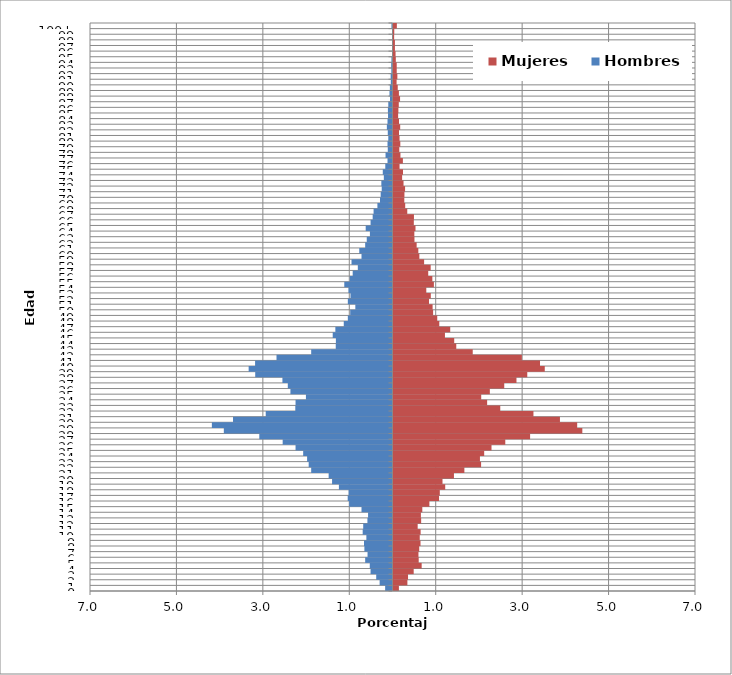
| Category | Hombres | Mujeres |
|---|---|---|
| 0 | -0.17 | 0.125 |
| 1 | -0.298 | 0.321 |
| 2 | -0.377 | 0.336 |
| 3 | -0.508 | 0.467 |
| 4 | -0.526 | 0.652 |
| 5 | -0.632 | 0.583 |
| 6 | -0.578 | 0.577 |
| 7 | -0.651 | 0.595 |
| 8 | -0.66 | 0.625 |
| 9 | -0.605 | 0.607 |
| 10 | -0.69 | 0.628 |
| 11 | -0.678 | 0.56 |
| 12 | -0.581 | 0.64 |
| 13 | -0.565 | 0.634 |
| 14 | -0.717 | 0.667 |
| 15 | -1.003 | 0.83 |
| 16 | -1.037 | 1.054 |
| 17 | -1.015 | 1.072 |
| 18 | -1.24 | 1.197 |
| 19 | -1.398 | 1.134 |
| 20 | -1.477 | 1.399 |
| 21 | -1.882 | 1.64 |
| 22 | -1.94 | 2.027 |
| 23 | -1.976 | 2 |
| 24 | -2.067 | 2.098 |
| 25 | -2.244 | 2.268 |
| 26 | -2.541 | 2.587 |
| 27 | -3.083 | 3.161 |
| 28 | -3.903 | 4.37 |
| 29 | -4.18 | 4.251 |
| 30 | -3.691 | 3.852 |
| 31 | -2.934 | 3.238 |
| 32 | -2.25 | 2.471 |
| 33 | -2.244 | 2.167 |
| 34 | -2.003 | 2.03 |
| 35 | -2.362 | 2.229 |
| 36 | -2.423 | 2.563 |
| 37 | -2.547 | 2.846 |
| 38 | -3.177 | 3.096 |
| 39 | -3.329 | 3.5 |
| 40 | -3.18 | 3.39 |
| 41 | -2.684 | 2.971 |
| 42 | -1.882 | 1.834 |
| 43 | -1.313 | 1.453 |
| 44 | -1.31 | 1.405 |
| 45 | -1.383 | 1.191 |
| 46 | -1.322 | 1.313 |
| 47 | -1.128 | 1.06 |
| 48 | -1.034 | 1.012 |
| 49 | -0.979 | 0.917 |
| 50 | -0.86 | 0.905 |
| 51 | -1.034 | 0.822 |
| 52 | -0.973 | 0.863 |
| 53 | -1.018 | 0.759 |
| 54 | -1.116 | 0.935 |
| 55 | -0.988 | 0.899 |
| 56 | -0.921 | 0.804 |
| 57 | -0.803 | 0.86 |
| 58 | -0.948 | 0.708 |
| 59 | -0.717 | 0.598 |
| 60 | -0.769 | 0.574 |
| 61 | -0.632 | 0.536 |
| 62 | -0.596 | 0.485 |
| 63 | -0.523 | 0.482 |
| 64 | -0.62 | 0.509 |
| 65 | -0.508 | 0.47 |
| 66 | -0.459 | 0.473 |
| 67 | -0.438 | 0.318 |
| 68 | -0.35 | 0.271 |
| 69 | -0.289 | 0.25 |
| 70 | -0.274 | 0.253 |
| 71 | -0.249 | 0.268 |
| 72 | -0.258 | 0.232 |
| 73 | -0.201 | 0.199 |
| 74 | -0.225 | 0.22 |
| 75 | -0.167 | 0.14 |
| 76 | -0.116 | 0.217 |
| 77 | -0.161 | 0.161 |
| 78 | -0.109 | 0.134 |
| 79 | -0.116 | 0.158 |
| 80 | -0.097 | 0.14 |
| 81 | -0.109 | 0.128 |
| 82 | -0.131 | 0.155 |
| 83 | -0.116 | 0.128 |
| 84 | -0.103 | 0.107 |
| 85 | -0.106 | 0.113 |
| 86 | -0.097 | 0.122 |
| 87 | -0.058 | 0.152 |
| 88 | -0.07 | 0.125 |
| 89 | -0.061 | 0.098 |
| 90 | -0.04 | 0.071 |
| 91 | -0.043 | 0.089 |
| 92 | -0.027 | 0.074 |
| 93 | -0.03 | 0.074 |
| 94 | -0.024 | 0.054 |
| 95 | -0.006 | 0.048 |
| 96 | -0.009 | 0.033 |
| 97 | -0.006 | 0.033 |
| 98 | -0.003 | 0.015 |
| 99 | -0.006 | 0.018 |
| 100+ | -0.024 | 0.077 |